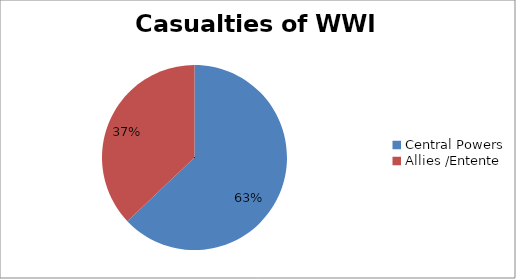
| Category | Series 0 |
|---|---|
| Central Powers | 37508686 |
| Allies /Entente | 22104209 |